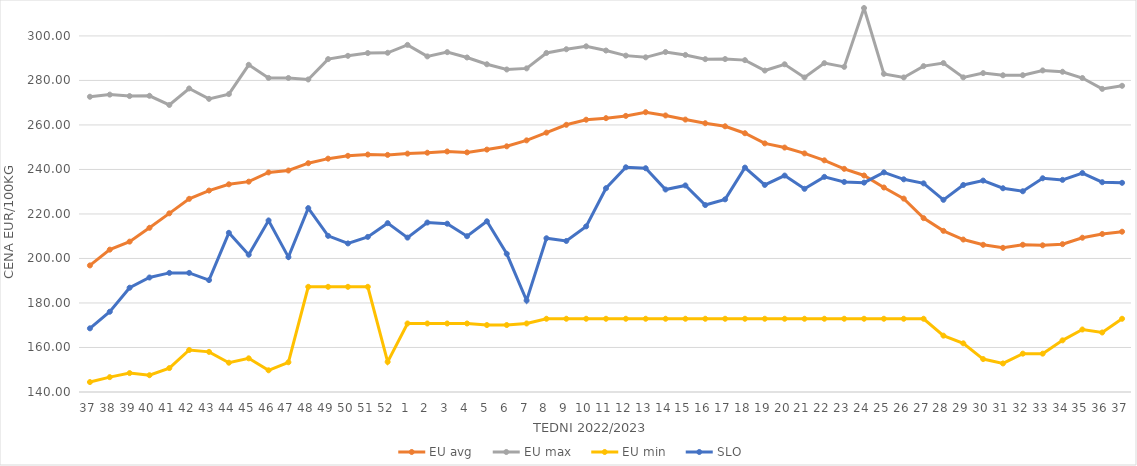
| Category | EU avg | EU max | EU min | SLO |
|---|---|---|---|---|
| 37.0 | 196.877 | 272.67 | 144.47 | 168.61 |
| 38.0 | 203.962 | 273.63 | 146.68 | 176.07 |
| 39.0 | 207.574 | 272.98 | 148.499 | 186.86 |
| 40.0 | 213.785 | 273.1 | 147.54 | 191.45 |
| 41.0 | 220.272 | 268.98 | 150.75 | 193.52 |
| 42.0 | 226.803 | 276.39 | 158.87 | 193.52 |
| 43.0 | 230.521 | 271.72 | 158.04 | 190.28 |
| 44.0 | 233.325 | 273.856 | 153.16 | 211.53 |
| 45.0 | 234.517 | 287.021 | 155.13 | 201.69 |
| 46.0 | 238.669 | 281.133 | 149.75 | 217.08 |
| 47.0 | 239.534 | 281.102 | 153.36 | 200.62 |
| 48.0 | 242.81 | 280.434 | 187.26 | 222.61 |
| 49.0 | 244.854 | 289.585 | 187.26 | 210.16 |
| 50.0 | 246.132 | 291.057 | 187.26 | 206.76 |
| 51.0 | 246.705 | 292.307 | 187.26 | 209.69 |
| 52.0 | 246.546 | 292.426 | 153.54 | 215.87 |
| 1.0 | 247.118 | 295.98 | 170.79 | 209.37 |
| 2.0 | 247.516 | 290.8 | 170.79 | 216.15 |
| 3.0 | 248.079 | 292.71 | 170.79 | 215.63 |
| 4.0 | 247.672 | 290.32 | 170.79 | 210 |
| 5.0 | 248.924 | 287.27 | 170.09 | 216.7 |
| 6.0 | 250.4 | 284.92 | 170.09 | 202.1 |
| 7.0 | 253.074 | 285.42 | 170.79 | 181.11 |
| 8.0 | 256.543 | 292.35 | 172.91 | 209.08 |
| 9.0 | 260.066 | 294.02 | 172.91 | 207.87 |
| 10.0 | 262.352 | 295.33 | 172.91 | 214.42 |
| 11.0 | 263.049 | 293.44 | 172.91 | 231.56 |
| 12.0 | 264.068 | 291.15 | 172.91 | 240.97 |
| 13.0 | 265.73 | 290.38 | 172.91 | 240.55 |
| 14.0 | 264.262 | 292.763 | 172.91 | 230.99 |
| 15.0 | 262.411 | 291.46 | 172.91 | 232.82 |
| 16.0 | 260.77 | 289.56 | 172.91 | 224 |
| 17.0 | 259.395 | 289.61 | 172.91 | 226.57 |
| 18.0 | 256.275 | 289.13 | 172.91 | 240.83 |
| 19.0 | 251.716 | 284.45 | 172.91 | 233.05 |
| 20.0 | 249.836 | 287.26 | 172.91 | 237.25 |
| 21.0 | 247.212 | 281.33 | 172.91 | 231.3 |
| 22.0 | 244.103 | 287.77 | 172.91 | 236.67 |
| 23.0 | 240.279 | 286.1 | 172.91 | 234.39 |
| 24.0 | 237.289 | 312.54 | 172.91 | 234.08 |
| 25.0 | 231.895 | 282.95 | 172.91 | 238.69 |
| 26.0 | 226.903 | 281.34 | 172.91 | 235.57 |
| 27.0 | 218.126 | 286.43 | 172.91 | 233.75 |
| 28.0 | 212.406 | 287.8 | 165.32 | 226.35 |
| 29.0 | 208.504 | 281.37 | 161.87 | 233.03 |
| 30.0 | 206.149 | 283.3 | 154.8 | 235 |
| 31.0 | 204.79 | 282.32 | 152.83 | 231.55 |
| 32.0 | 206.16 | 282.36 | 157.23 | 230.2 |
| 33.0 | 205.917 | 284.5 | 157.23 | 236.04 |
| 34.0 | 206.436 | 283.9 | 163.21 | 235.32 |
| 35.0 | 209.326 | 281.09 | 168.085 | 238.39 |
| 36.0 | 211.007 | 276.21 | 166.745 | 234.27 |
| 37.0 | 212.031 | 277.59 | 172.91 | 234 |